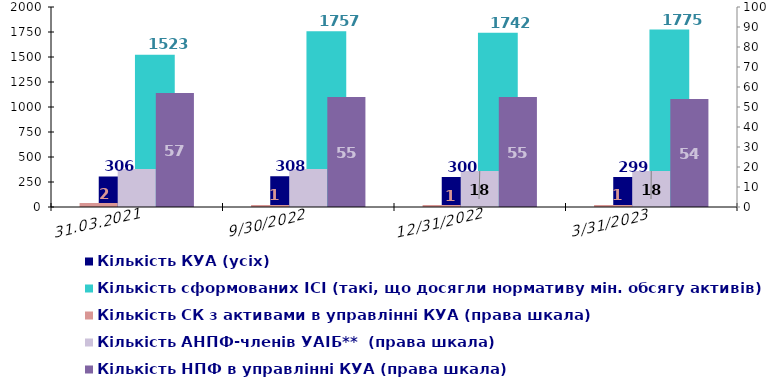
| Category | Кількість КУА (усіх) | Кількість КУА з ІСІ в управлінні | Кількість ІСІ в управлінні  | Кількість сформованих ІСІ (такі, що досягли нормативу мін. обсягу активів)  |
|---|---|---|---|---|
| 31.03.2021 | 306 |  |  | 1523 |
| 30.09.2022 | 308 |  |  | 1757 |
| 31.12.2022 | 300 |  |  | 1742 |
| 31.03.2023 | 299 |  |  | 1775 |